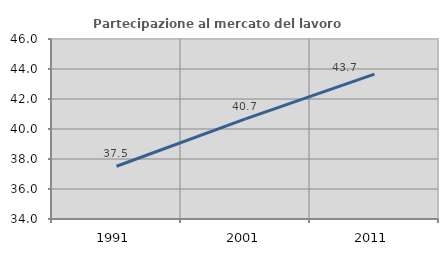
| Category | Partecipazione al mercato del lavoro  femminile |
|---|---|
| 1991.0 | 37.518 |
| 2001.0 | 40.674 |
| 2011.0 | 43.656 |